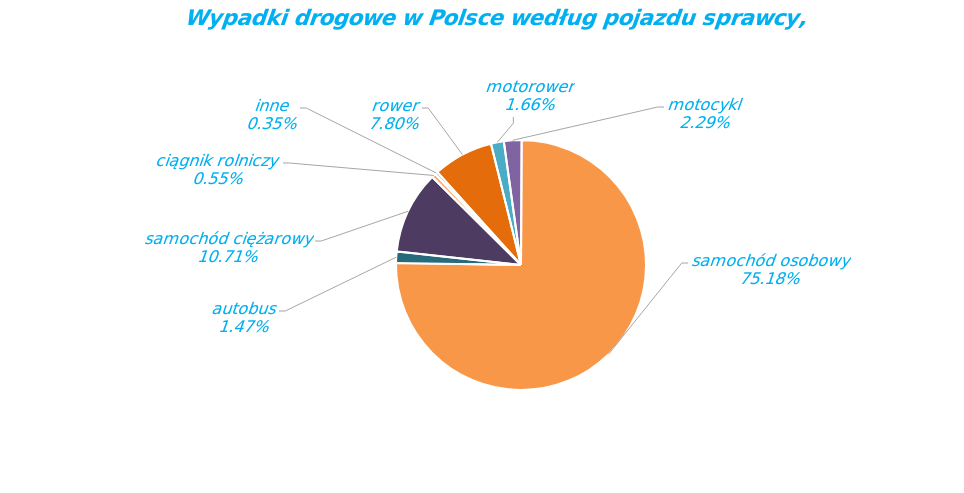
| Category | Series 0 |
|---|---|
| rower | 2930 |
| motorower | 624 |
| motocykl | 858 |
| samochód osobowy | 28228 |
| autobus | 550 |
| samochód ciężarowy | 4019 |
| ciągnik rolniczy | 207 |
| inne | 132 |